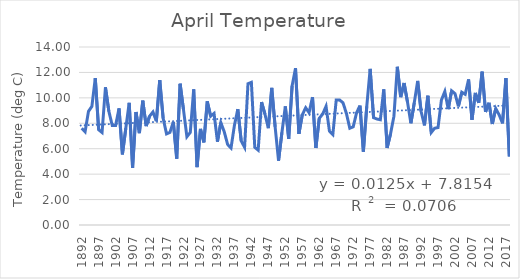
| Category | Series 0 |
|---|---|
| 1892.0 | 7.611 |
| 1893.0 | 7.333 |
| 1894.0 | 8.944 |
| 1895.0 | 9.333 |
| 1896.0 | 11.556 |
| 1897.0 | 7.5 |
| 1898.0 | 7.278 |
| 1899.0 | 10.833 |
| 1900.0 | 8.944 |
| 1901.0 | 7.833 |
| 1902.0 | 7.833 |
| 1903.0 | 9.167 |
| 1904.0 | 5.556 |
| 1905.0 | 7.611 |
| 1906.0 | 9.611 |
| 1907.0 | 4.5 |
| 1908.0 | 8.889 |
| 1909.0 | 7.222 |
| 1910.0 | 9.778 |
| 1911.0 | 7.778 |
| 1912.0 | 8.556 |
| 1913.0 | 8.889 |
| 1914.0 | 8.167 |
| 1915.0 | 11.389 |
| 1916.0 | 8.389 |
| 1917.0 | 7.167 |
| 1918.0 | 7.278 |
| 1919.0 | 8.111 |
| 1920.0 | 5.222 |
| 1921.0 | 11.111 |
| 1922.0 | 9.056 |
| 1923.0 | 6.944 |
| 1924.0 | 7.278 |
| 1925.0 | 10.667 |
| 1926.0 | 4.556 |
| 1927.0 | 7.556 |
| 1928.0 | 6.5 |
| 1929.0 | 9.722 |
| 1930.0 | 8.556 |
| 1931.0 | 8.778 |
| 1932.0 | 6.556 |
| 1933.0 | 8.056 |
| 1934.0 | 7.333 |
| 1935.0 | 6.333 |
| 1936.0 | 6.056 |
| 1937.0 | 7.833 |
| 1938.0 | 9.111 |
| 1939.0 | 6.611 |
| 1940.0 | 6.111 |
| 1941.0 | 11.111 |
| 1942.0 | 11.222 |
| 1943.0 | 6.111 |
| 1944.0 | 5.889 |
| 1945.0 | 9.667 |
| 1946.0 | 8.722 |
| 1947.0 | 7.611 |
| 1948.0 | 10.778 |
| 1949.0 | 7.722 |
| 1950.0 | 5.056 |
| 1951.0 | 7.278 |
| 1952.0 | 9.333 |
| 1953.0 | 6.778 |
| 1954.0 | 10.944 |
| 1955.0 | 12.333 |
| 1956.0 | 7.167 |
| 1957.0 | 8.667 |
| 1958.0 | 9.222 |
| 1959.0 | 8.833 |
| 1960.0 | 10.056 |
| 1961.0 | 6.056 |
| 1962.0 | 8.389 |
| 1963.0 | 8.722 |
| 1964.0 | 9.333 |
| 1965.0 | 7.389 |
| 1966.0 | 7.111 |
| 1967.0 | 9.833 |
| 1968.0 | 9.833 |
| 1969.0 | 9.611 |
| 1970.0 | 8.778 |
| 1971.0 | 7.611 |
| 1972.0 | 7.722 |
| 1973.0 | 8.833 |
| 1974.0 | 9.389 |
| 1975.0 | 5.778 |
| 1976.0 | 9.333 |
| 1977.0 | 12.278 |
| 1978.0 | 8.444 |
| 1979.0 | 8.333 |
| 1980.0 | 8.278 |
| 1981.0 | 10.667 |
| 1982.0 | 6.056 |
| 1983.0 | 7.167 |
| 1984.0 | 8.556 |
| 1985.0 | 12.444 |
| 1986.0 | 10.056 |
| 1987.0 | 11.167 |
| 1988.0 | 9.667 |
| 1989.0 | 8 |
| 1990.0 | 9.611 |
| 1991.0 | 11.333 |
| 1992.0 | 8.944 |
| 1993.0 | 7.833 |
| 1994.0 | 10.167 |
| 1995.0 | 7.278 |
| 1996.0 | 7.611 |
| 1997.0 | 7.667 |
| 1998.0 | 9.833 |
| 1999.0 | 10.5 |
| 2000.0 | 9.111 |
| 2001.0 | 10.556 |
| 2002.0 | 10.333 |
| 2003.0 | 9.333 |
| 2004.0 | 10.444 |
| 2005.0 | 10.278 |
| 2006.0 | 11.444 |
| 2007.0 | 8.278 |
| 2008.0 | 10.389 |
| 2009.0 | 9.611 |
| 2010.0 | 12.056 |
| 2011.0 | 8.889 |
| 2012.0 | 9.611 |
| 2013.0 | 7.944 |
| 2014.0 | 9.16 |
| 2015.0 | 8.667 |
| 2016.0 | 8 |
| 2017.0 | 11.556 |
| 2018.0 | 5.389 |